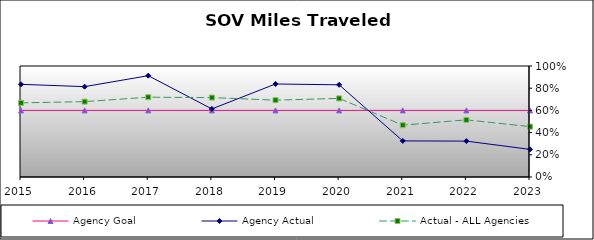
| Category | Agency Goal | Agency Actual | Actual - ALL Agencies |
|---|---|---|---|
| 2015.0 | 0.6 | 0.835 | 0.668 |
| 2016.0 | 0.6 | 0.814 | 0.679 |
| 2017.0 | 0.6 | 0.913 | 0.719 |
| 2018.0 | 0.6 | 0.613 | 0.715 |
| 2019.0 | 0.6 | 0.838 | 0.692 |
| 2020.0 | 0.6 | 0.83 | 0.708 |
| 2021.0 | 0.6 | 0.325 | 0.467 |
| 2022.0 | 0.6 | 0.323 | 0.515 |
| 2023.0 | 0.6 | 0.249 | 0.454 |